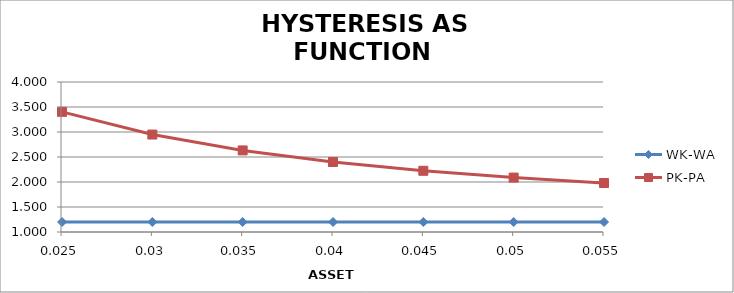
| Category | WK-WA | PK-PA |
|---|---|---|
| 0.025 | 1.2 | 3.403 |
| 0.030000000000000002 | 1.2 | 2.949 |
| 0.035 | 1.2 | 2.632 |
| 0.04 | 1.2 | 2.4 |
| 0.045 | 1.2 | 2.225 |
| 0.049999999999999996 | 1.2 | 2.088 |
| 0.05499999999999999 | 1.2 | 1.98 |